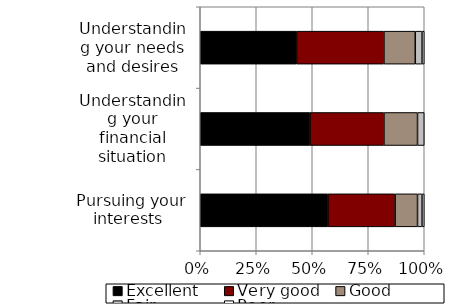
| Category | Excellent | Very good | Good | Fair | Poor |
|---|---|---|---|---|---|
| Pursuing your interests  | 0.57 | 0.3 | 0.1 | 0.02 | 0.01 |
| Understanding your financial situation | 0.49 | 0.33 | 0.15 | 0.03 | 0 |
| Understanding your needs and desires | 0.43 | 0.39 | 0.14 | 0.03 | 0.01 |